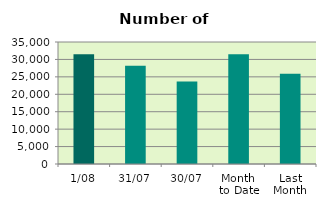
| Category | Series 0 |
|---|---|
| 1/08 | 31500 |
| 31/07 | 28208 |
| 30/07 | 23684 |
| Month 
to Date | 31500 |
| Last
Month | 25883.727 |